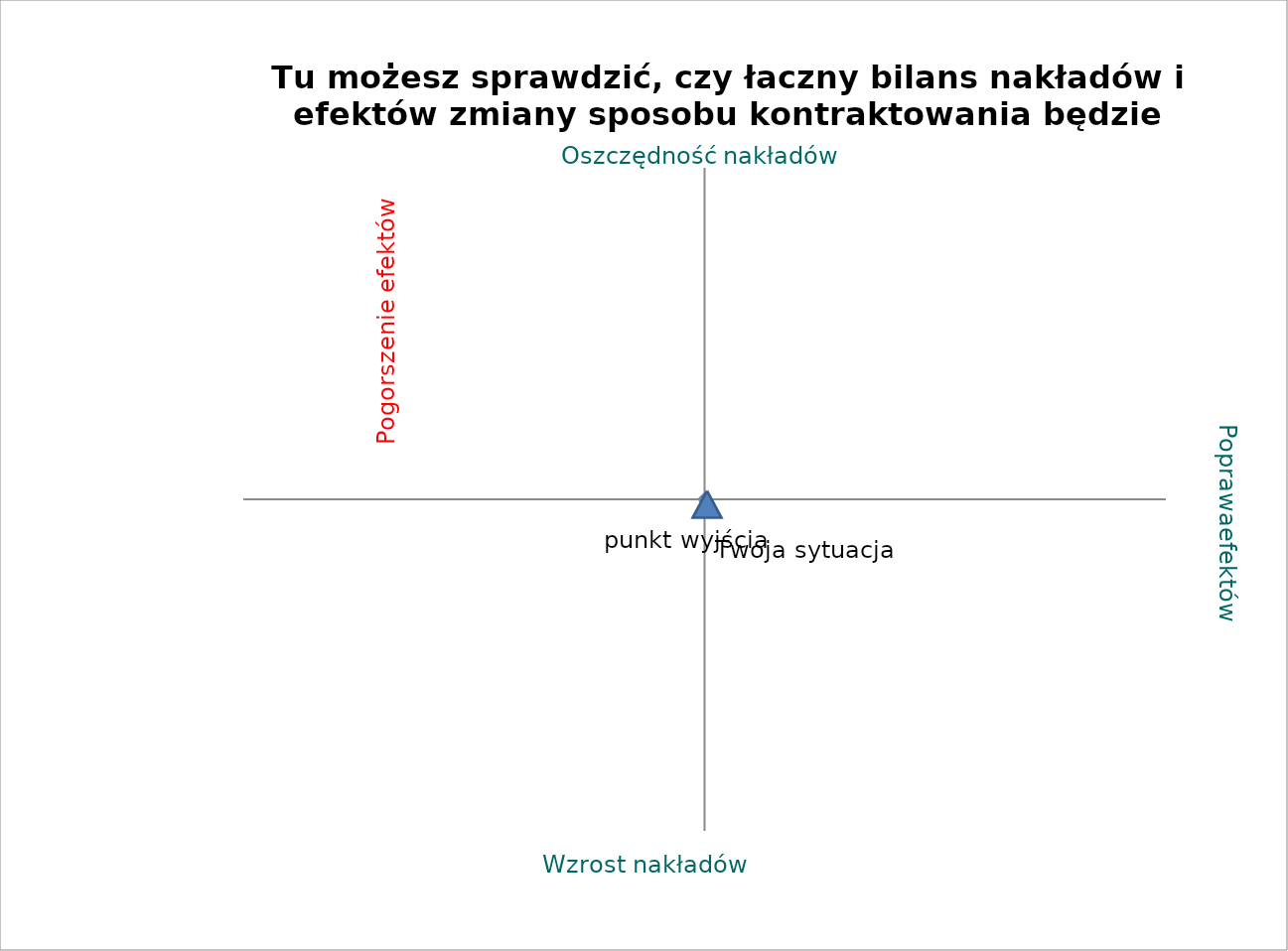
| Category | Twoja sytuacja |
|---|---|
| 0.0 | 0 |